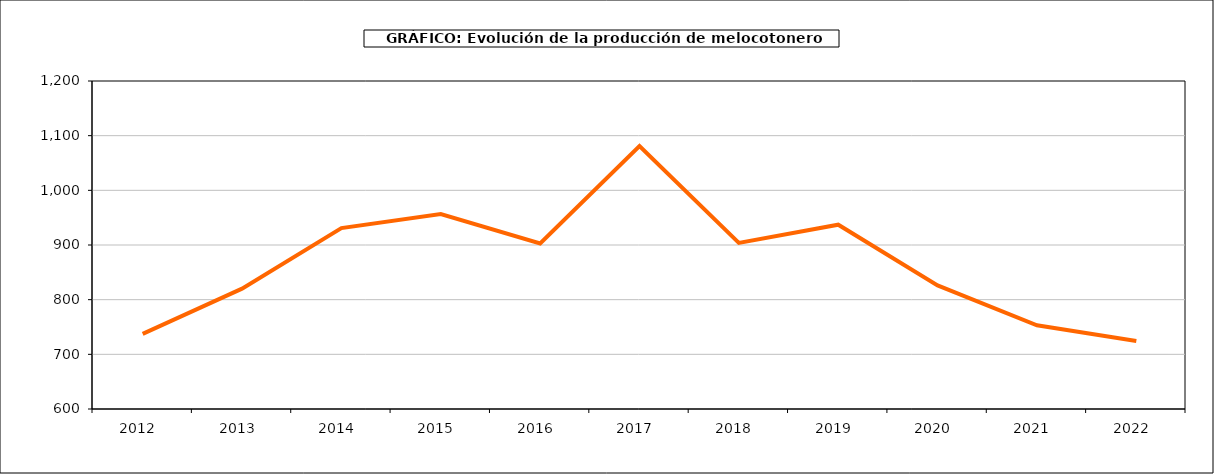
| Category | producción melocotonero |
|---|---|
| 2012.0 | 737.531 |
| 2013.0 | 820.139 |
| 2014.0 | 930.862 |
| 2015.0 | 956.688 |
| 2016.0 | 902.884 |
| 2017.0 | 1081.157 |
| 2018.0 | 903.809 |
| 2019.0 | 937.166 |
| 2020.0 | 825.954 |
| 2021.0 | 753.205 |
| 2022.0 | 724.374 |